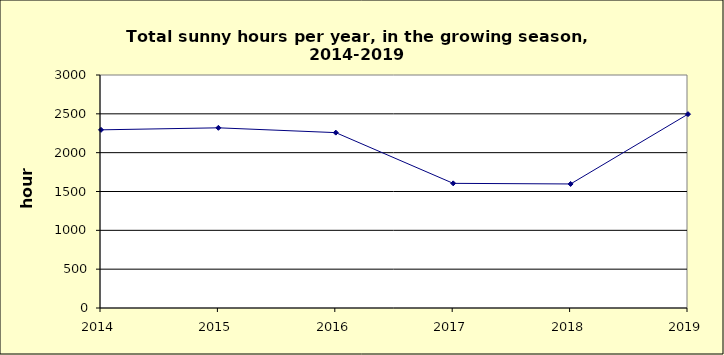
| Category | Series 0 |
|---|---|
| 2014.0 | 2294 |
| 2015.0 | 2320 |
| 2016.0 | 2258 |
| 2017.0 | 1605 |
| 2018.0 | 1597 |
| 2019.0 | 2496 |